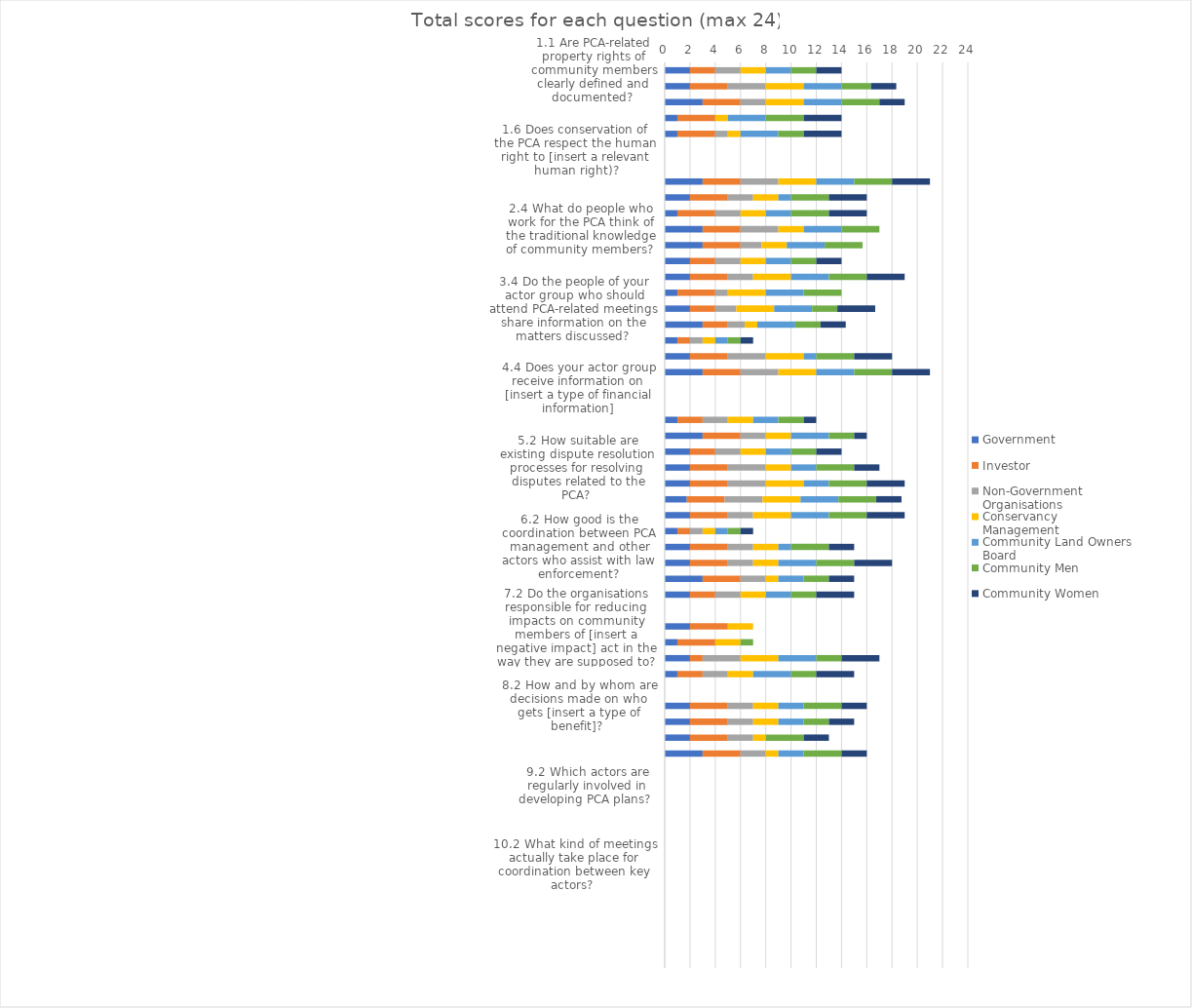
| Category | Government  | Investor | Non-Government Organisations | Conservancy Management | Community Land Owners Board | Community Men  | Community Women  |
|---|---|---|---|---|---|---|---|
| 1.1 Are PCA-related property rights of community members clearly defined and documented?  | 2 | 2 | 2 | 2 | 2 | 2 | 2 |
| 1.2 What proportion of adults in the community who have a right to [insert a relevant right] are aware of this?  | 2 | 3 | 3 | 3 | 3 | 2.333 | 2 |
| 1.3 What proportion of adults in the community who have this right can exercise it?  | 3 | 3 | 2 | 3 | 3 | 3 | 2 |
| 1.4 What proportion of adults in the community who have a right to [insert a relevant right] are aware of this?  | 1 | 3 | 0 | 1 | 3 | 3 | 3 |
| 1.5 What proportion of adults in the community who have this right can exercise it?  | 1 | 3 | 1 | 1 | 3 | 2 | 3 |
| 1.6 Does conservation of the PCA respect the human right to [insert a relevant human right)? | 0 | 0 | 0 | 0 | 0 | 0 | 0 |
| 1.7 Does conservation of the PCA respect the human right to [insert a relevant human right)? | 0 | 0 | 0 | 0 | 0 | 0 | 0 |
| 2.1 What kind of stakeholder/actor analysis (SA) has been done?  | 3 | 3 | 3 | 3 | 3 | 3 | 3 |
| 2.2 How do people who work for the PCA regard community members and their interests in the PCA?  | 2 | 3 | 2 | 2 | 1 | 3 | 3 |
| 2.3 How do community members regard people who work for the PCA and the roles that they perform?  | 1 | 3 | 2 | 2 | 2 | 3 | 3 |
| 2.4 What do people who work for the PCA think of the traditional knowledge of community members?  | 3 | 3 | 3 | 2 | 3 | 3 | 0 |
| 2.5 Is there any negative bias against any particular group of actors?  | 3 | 3 | 1.667 | 2 | 3 | 3 | 0 |
| 3.1 Are the governance structures and processes for decision-making clearly defined and documented? | 2 | 2 | 2 | 2 | 2 | 2 | 2 |
| 3.2 What kind of PCA-related decisions are people of your actor group involved in?  | 2 | 3 | 2 | 3 | 3 | 3 | 3 |
| 3.3 When people of your actor group attend PCA-related meetings, do they have the information they need to contribute? | 1 | 3 | 1 | 3 | 3 | 3 | 0 |
| 3.4 Do the people of your actor group who should attend PCA-related meetings share information on the matters discussed?  | 2 | 2 | 1.667 | 3 | 3 | 2 | 3 |
| 3.5 How much influence does your actor group have on PCA-related decisions that are important to your actor group?  | 3 | 2 | 1.333 | 1 | 3 | 2 | 2 |
| 4.1  Are the PCA-related responsibilities of key actors clearly defined and documented? | 1 | 1 | 1 | 1 | 1 | 1 | 1 |
| 4.2 What proportion of adults in the community know the location of PCA boundaries in their area?  | 2 | 3 | 3 | 3 | 1 | 3 | 3 |
| 4.3 If community members know of a threat to the PCA from their community do they report this to [insert name of the relevant authority]?  | 3 | 3 | 3 | 3 | 3 | 3 | 3 |
| 4.4 Does your actor group receive information on [insert a type of financial information] | 0 | 0 | 0 | 0 | 0 | 0 | 0 |
| 4.5 Are funds for conservation of the PCA and related support to communities being properly used? | 0 | 0 | 0 | 0 | 0 | 0 | 0 |
| 4.6 What does your actor group do if seriously concerned about how another actor performs on a key PCA-related responsibility? | 1 | 2 | 2 | 2 | 2 | 2 | 1 |
| 4.7 What happens if someone in your own actor group performs poorly on a key PCA-related responsibility? | 3 | 3 | 2 | 2 | 3 | 2 | 1 |
| 5.1 Are existing dispute resolution processes relevant to the PCA clearly documented?  | 2 | 2 | 2 | 2 | 2 | 2 | 2 |
| 5.2 How suitable are existing dispute resolution processes for resolving disputes related to the PCA?  | 2 | 3 | 3 | 2 | 2 | 3 | 2 |
| 5.3 What proportion of adults in the community are aware of these dispute resolution processes?  | 2 | 3 | 3 | 3 | 2 | 3 | 3 |
| 5.4 What proportion of adults in the community are able to use a dispute resolution process if they want to?  | 1.75 | 3 | 3 | 3 | 3 | 3 | 2 |
| 5.5 How often do dispute resolution processes succeed in resolving PCA-related disputes?  | 2 | 3 | 2 | 3 | 3 | 3 | 3 |
| 6.1 Are PCA-related laws and regulations clearly defined and documented?  | 1 | 1 | 1 | 1 | 1 | 1 | 1 |
| 6.2 How good is the coordination between PCA management and other actors who assist with law enforcement? | 2 | 3 | 2 | 2 | 1 | 3 | 2 |
| 6.3 Are incidents of law-breaking dealt with according to the law and are similar cases treated in the same way?  | 2 | 3 | 2 | 2 | 3 | 3 | 3 |
| 6.4 How is the conduct of people responsible for enforcing PCA laws when interacting with community members?  | 3 | 3 | 2 | 1 | 2 | 2 | 2 |
| 6.5 How effective are law enforcement activities in reducing law-breaking?  | 2 | 2 | 2 | 2 | 2 | 2 | 3 |
| 7.1 Have there been any recent studies of the negative impacts of the PCA and its conservation on the wellbeing of community members? | 0 | 0 | 0 | 0 | 0 | 0 | 0 |
| 7.2 Do the organisations responsible for reducing impacts on community members of [insert a negative impact] act in the way they are supposed to? | 2 | 3 | 0 | 2 | 0 | 0 | 0 |
| 7.3 How successful are their actions in reducing the impacts on community members of [insert a negative impact]?  | 1 | 3 | 0 | 2 | 0 | 1 | 0 |
| 7.4 Do the organisations responsible for reducing impacts on community members of [insert negative impact] act in the way they are supposed to? | 2 | 1 | 3 | 3 | 3 | 2 | 3 |
| 7.5 How successful are their actions in reducing the impacts on community members of [insert negative impact]?  | 1 | 2 | 2 | 2 | 3 | 2 | 3 |
| 8.1 Have there been any recent studies of the positive impacts of the PCA and its conservation on the wellbeing of community members? | 0 | 0 | 0 | 0 | 0 | 0 | 0 |
| 8.2 How and by whom are decisions made on who gets [insert a type of benefit]?  | 2 | 3 | 2 | 2 | 2 | 3 | 2 |
| 8.3 Is [insert a type of benefit] provided to communities in line with the decision(s)? | 2 | 3 | 2 | 2 | 2 | 2 | 2 |
| 8.4 How and by whom are decisions made on who gets [insert a type of benefit]?  | 2 | 3 | 2 | 1 | 0 | 3 | 2 |
| 8.5 Is [insert a type of benefit] provided to communities in line with the decision(s)?   | 3 | 3 | 2 | 1 | 2 | 3 | 2 |
| 9.1 Which actors have their PCA-related activities included in the PCA management plan?  | 0 | 0 | 0 | 0 | 0 | 0 | 0 |
| 9.2 Which actors are regularly involved in developing PCA plans?  | 0 | 0 | 0 | 0 | 0 | 0 | 0 |
| 9.3 Does the existing PCA management plan make use of any local and traditional knowledge?  | 0 | 0 | 0 | 0 | 0 | 0 | 0 |
| 9.4 Have there been changes in PCA management activities in response to learning?  | 0 | 0 | 0 | 0 | 0 | 0 | 0 |
| 9.5 Is the objective of [insert an important conservation objective] being achieved?  | 0 | 0 | 0 | 0 | 0 | 0 | 0 |
| 10.1 Are the structures and processes for coordination between actors clearly defined and documented?  | 0 | 0 | 0 | 0 | 0 | 0 | 0 |
| 10.2 What kind of meetings actually take place for coordination between key actors?  | 0 | 0 | 0 | 0 | 0 | 0 | 0 |
| 10.3 How good is information sharing between organisations of key actors at site level?  | 0 | 0 | 0 | 0 | 0 | 0 | 0 |
| 10.4 How good is the coordination of activities between the organisations of key actors at site level?  | 0 | 0 | 0 | 0 | 0 | 0 | 0 |
| 10.5 How good is the alignment of policies and plans between organisations of key actors at lower and higher levels?  | 0 | 0 | 0 | 0 | 0 | 0 | 0 |